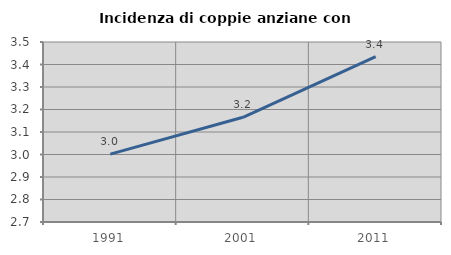
| Category | Incidenza di coppie anziane con figli |
|---|---|
| 1991.0 | 3.002 |
| 2001.0 | 3.165 |
| 2011.0 | 3.435 |